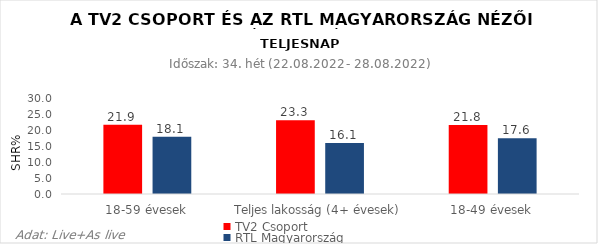
| Category | TV2 Csoport | RTL Magyarország |
|---|---|---|
| 18-59 évesek | 21.9 | 18.1 |
| Teljes lakosság (4+ évesek) | 23.3 | 16.1 |
| 18-49 évesek | 21.8 | 17.6 |